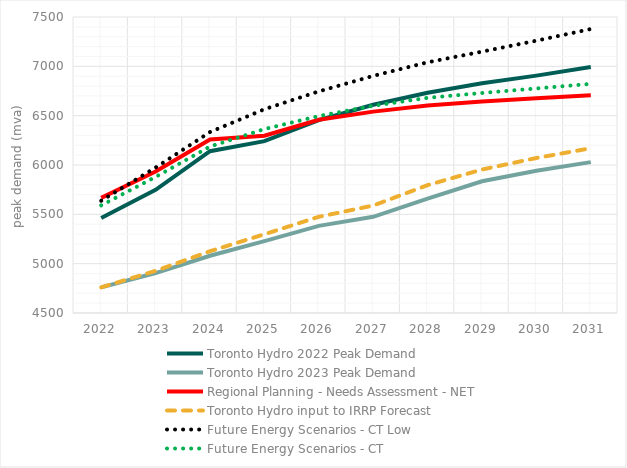
| Category | Toronto Hydro 2022 Peak Demand  | Toronto Hydro 2023 Peak Demand  | Regional Planning - Needs Assessment - NET | Toronto Hydro input to IRRP Forecast | Future Energy Scenarios - CT Low | Future Energy Scenarios - CT  |
|---|---|---|---|---|---|---|
| 2022.0 | 5463 | 4760 | 5667 | 4760 | 5638 | 5591 |
| 2023.0 | 5749 | 4905 | 5934 | 4927 | 5974 | 5879 |
| 2024.0 | 6140 | 5080 | 6259 | 5126 | 6334 | 6187 |
| 2025.0 | 6242 | 5229 | 6297 | 5298 | 6565 | 6364 |
| 2026.0 | 6455 | 5383 | 6458 | 5475 | 6746 | 6496 |
| 2027.0 | 6610 | 5475 | 6541 | 5589 | 6903 | 6600 |
| 2028.0 | 6732 | 5659 | 6604 | 5796 | 7041 | 6681 |
| 2029.0 | 6829 | 5835 | 6643 | 5954 | 7149 | 6730 |
| 2030.0 | 6906 | 5941 | 6676 | 6071 | 7260 | 6776 |
| 2031.0 | 6994 | 6029 | 6707 | 6170 | 7378 | 6822 |